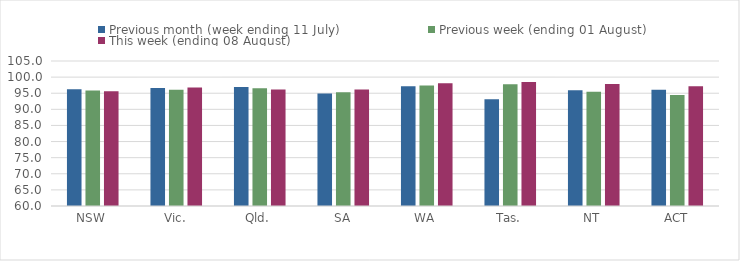
| Category | Previous month (week ending 11 July) | Previous week (ending 01 August) | This week (ending 08 August) |
|---|---|---|---|
| NSW | 96.268 | 95.864 | 95.576 |
| Vic. | 96.626 | 96.091 | 96.801 |
| Qld. | 96.894 | 96.52 | 96.187 |
| SA | 94.949 | 95.32 | 96.177 |
| WA | 97.192 | 97.366 | 98.064 |
| Tas. | 93.16 | 97.759 | 98.456 |
| NT | 95.933 | 95.491 | 97.897 |
| ACT | 96.082 | 94.417 | 97.19 |